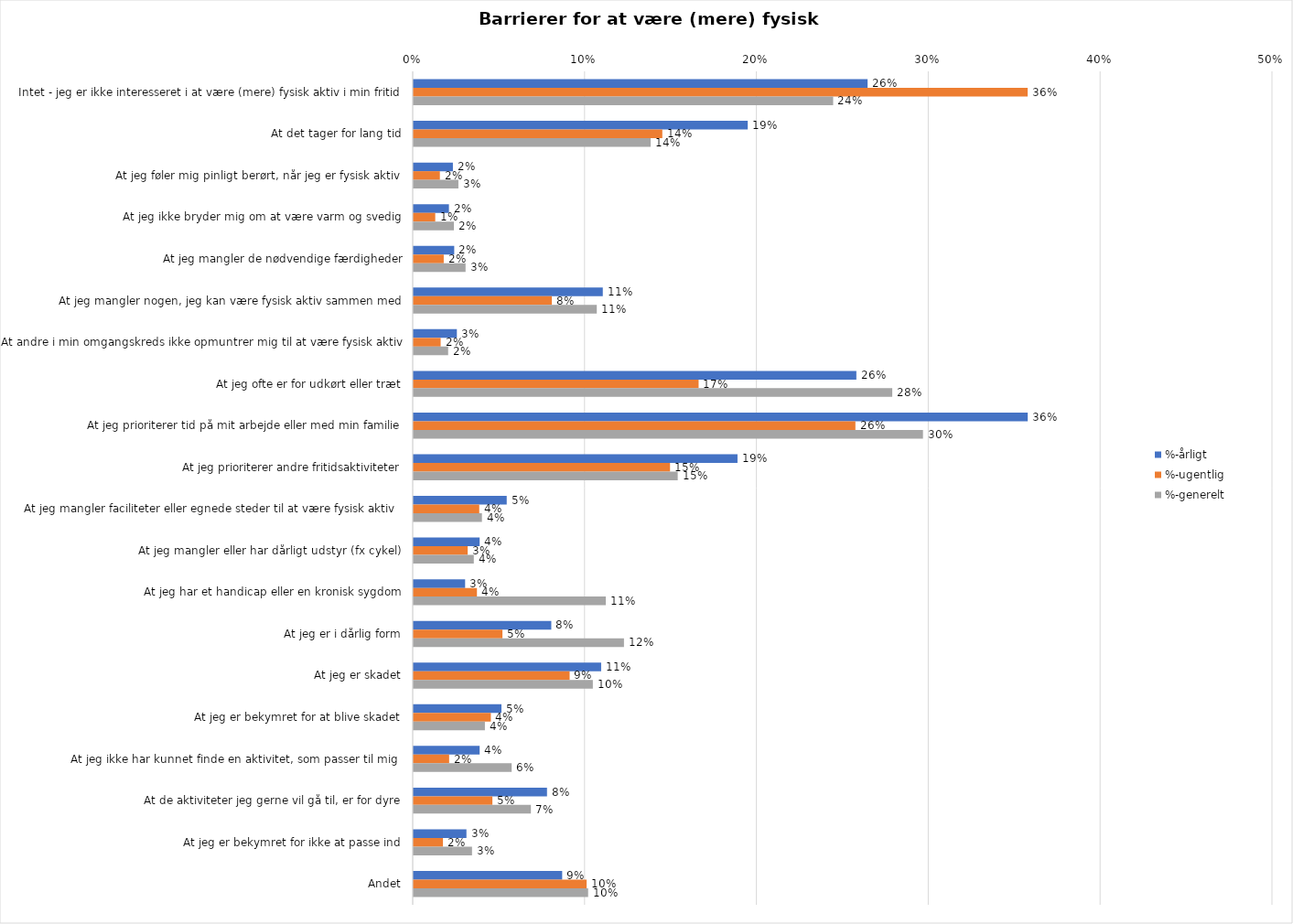
| Category | %-årligt | %-ugentlig | %-generelt |
|---|---|---|---|
| Intet - jeg er ikke interesseret i at være (mere) fysisk aktiv i min fritid | 0.264 | 0.357 | 0.244 |
| At det tager for lang tid | 0.194 | 0.145 | 0.138 |
| At jeg føler mig pinligt berørt, når jeg er fysisk aktiv | 0.023 | 0.015 | 0.026 |
| At jeg ikke bryder mig om at være varm og svedig | 0.021 | 0.013 | 0.023 |
| At jeg mangler de nødvendige færdigheder | 0.024 | 0.018 | 0.03 |
| At jeg mangler nogen, jeg kan være fysisk aktiv sammen med | 0.11 | 0.08 | 0.107 |
| At andre i min omgangskreds ikke opmuntrer mig til at være fysisk aktiv | 0.025 | 0.016 | 0.02 |
| At jeg ofte er for udkørt eller træt | 0.258 | 0.166 | 0.279 |
| At jeg prioriterer tid på mit arbejde eller med min familie | 0.357 | 0.257 | 0.296 |
| At jeg prioriterer andre fritidsaktiviteter | 0.188 | 0.149 | 0.154 |
| At jeg mangler faciliteter eller egnede steder til at være fysisk aktiv  | 0.054 | 0.038 | 0.04 |
| At jeg mangler eller har dårligt udstyr (fx cykel) | 0.038 | 0.031 | 0.035 |
| At jeg har et handicap eller en kronisk sygdom | 0.03 | 0.037 | 0.112 |
| At jeg er i dårlig form | 0.08 | 0.052 | 0.122 |
| At jeg er skadet | 0.109 | 0.091 | 0.104 |
| At jeg er bekymret for at blive skadet | 0.051 | 0.045 | 0.041 |
| At jeg ikke har kunnet finde en aktivitet, som passer til mig  | 0.038 | 0.021 | 0.057 |
| At de aktiviteter jeg gerne vil gå til, er for dyre | 0.078 | 0.046 | 0.068 |
| At jeg er bekymret for ikke at passe ind | 0.031 | 0.017 | 0.034 |
| Andet | 0.086 | 0.101 | 0.102 |